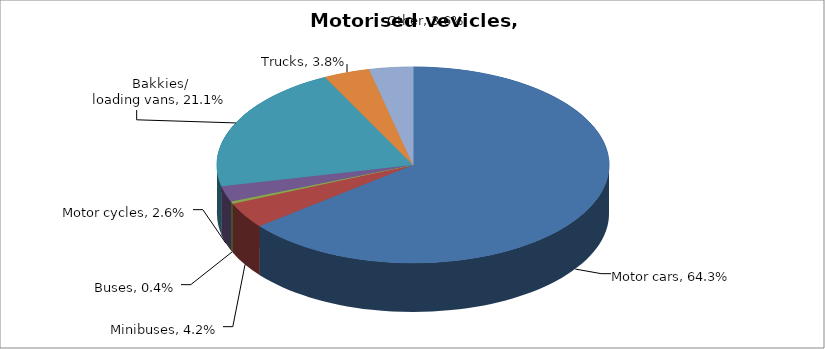
| Category | Series 0 |
|---|---|
| Motor cars | 0.643 |
| Minibuses | 0.042 |
| Buses | 0.004 |
| Motor cycles | 0.026 |
| Bakkies/
loading vans | 0.211 |
| Trucks | 0.038 |
| Other | 0.036 |